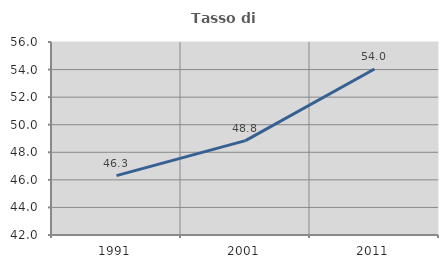
| Category | Tasso di occupazione   |
|---|---|
| 1991.0 | 46.31 |
| 2001.0 | 48.844 |
| 2011.0 | 54.045 |